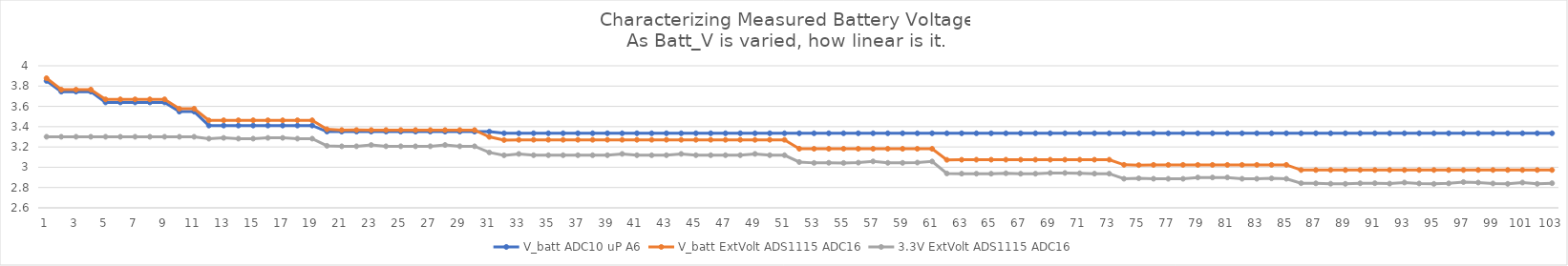
| Category | V_batt ADC10 uP A6 | V_batt ExtVolt ADS1115 ADC16 | 3.3V ExtVolt ADS1115 ADC16 |
|---|---|---|---|
| 0 | 3.851 | 3.878 | 3.3 |
| 1 | 3.745 | 3.765 | 3.3 |
| 2 | 3.745 | 3.765 | 3.3 |
| 3 | 3.745 | 3.766 | 3.3 |
| 4 | 3.639 | 3.669 | 3.3 |
| 5 | 3.639 | 3.669 | 3.3 |
| 6 | 3.639 | 3.669 | 3.3 |
| 7 | 3.639 | 3.669 | 3.3 |
| 8 | 3.639 | 3.67 | 3.3 |
| 9 | 3.548 | 3.577 | 3.3 |
| 10 | 3.548 | 3.577 | 3.3 |
| 11 | 3.411 | 3.462 | 3.281 |
| 12 | 3.411 | 3.463 | 3.29 |
| 13 | 3.411 | 3.463 | 3.282 |
| 14 | 3.411 | 3.463 | 3.282 |
| 15 | 3.411 | 3.463 | 3.29 |
| 16 | 3.411 | 3.462 | 3.29 |
| 17 | 3.411 | 3.463 | 3.282 |
| 18 | 3.411 | 3.463 | 3.282 |
| 19 | 3.351 | 3.374 | 3.211 |
| 20 | 3.351 | 3.367 | 3.206 |
| 21 | 3.351 | 3.367 | 3.207 |
| 22 | 3.351 | 3.366 | 3.219 |
| 23 | 3.351 | 3.367 | 3.207 |
| 24 | 3.351 | 3.366 | 3.207 |
| 25 | 3.351 | 3.367 | 3.206 |
| 26 | 3.351 | 3.366 | 3.207 |
| 27 | 3.351 | 3.366 | 3.219 |
| 28 | 3.351 | 3.367 | 3.207 |
| 29 | 3.351 | 3.367 | 3.207 |
| 30 | 3.351 | 3.3 | 3.146 |
| 31 | 3.335 | 3.268 | 3.118 |
| 32 | 3.335 | 3.27 | 3.132 |
| 33 | 3.335 | 3.27 | 3.119 |
| 34 | 3.335 | 3.27 | 3.119 |
| 35 | 3.335 | 3.27 | 3.119 |
| 36 | 3.335 | 3.27 | 3.119 |
| 37 | 3.335 | 3.27 | 3.119 |
| 38 | 3.335 | 3.27 | 3.119 |
| 39 | 3.335 | 3.27 | 3.132 |
| 40 | 3.335 | 3.27 | 3.119 |
| 41 | 3.335 | 3.27 | 3.119 |
| 42 | 3.335 | 3.27 | 3.119 |
| 43 | 3.335 | 3.27 | 3.132 |
| 44 | 3.335 | 3.27 | 3.119 |
| 45 | 3.335 | 3.27 | 3.119 |
| 46 | 3.335 | 3.27 | 3.119 |
| 47 | 3.335 | 3.27 | 3.119 |
| 48 | 3.335 | 3.27 | 3.132 |
| 49 | 3.335 | 3.27 | 3.119 |
| 50 | 3.335 | 3.27 | 3.119 |
| 51 | 3.335 | 3.183 | 3.052 |
| 52 | 3.335 | 3.182 | 3.043 |
| 53 | 3.335 | 3.182 | 3.044 |
| 54 | 3.335 | 3.182 | 3.042 |
| 55 | 3.335 | 3.182 | 3.045 |
| 56 | 3.335 | 3.182 | 3.058 |
| 57 | 3.335 | 3.182 | 3.044 |
| 58 | 3.335 | 3.182 | 3.044 |
| 59 | 3.335 | 3.182 | 3.046 |
| 60 | 3.335 | 3.182 | 3.057 |
| 61 | 3.335 | 3.073 | 2.938 |
| 62 | 3.335 | 3.074 | 2.937 |
| 63 | 3.335 | 3.074 | 2.936 |
| 64 | 3.335 | 3.074 | 2.936 |
| 65 | 3.335 | 3.074 | 2.941 |
| 66 | 3.335 | 3.074 | 2.936 |
| 67 | 3.335 | 3.074 | 2.936 |
| 68 | 3.335 | 3.074 | 2.944 |
| 69 | 3.335 | 3.074 | 2.944 |
| 70 | 3.335 | 3.074 | 2.941 |
| 71 | 3.335 | 3.074 | 2.937 |
| 72 | 3.335 | 3.074 | 2.936 |
| 73 | 3.335 | 3.024 | 2.887 |
| 74 | 3.335 | 3.021 | 2.891 |
| 75 | 3.335 | 3.023 | 2.887 |
| 76 | 3.335 | 3.024 | 2.886 |
| 77 | 3.335 | 3.024 | 2.886 |
| 78 | 3.335 | 3.023 | 2.899 |
| 79 | 3.335 | 3.023 | 2.899 |
| 80 | 3.335 | 3.023 | 2.899 |
| 81 | 3.335 | 3.024 | 2.886 |
| 82 | 3.335 | 3.024 | 2.886 |
| 83 | 3.335 | 3.024 | 2.89 |
| 84 | 3.335 | 3.024 | 2.886 |
| 85 | 3.335 | 2.972 | 2.843 |
| 86 | 3.335 | 2.972 | 2.842 |
| 87 | 3.335 | 2.973 | 2.838 |
| 88 | 3.335 | 2.972 | 2.837 |
| 89 | 3.335 | 2.973 | 2.842 |
| 90 | 3.335 | 2.972 | 2.843 |
| 91 | 3.335 | 2.973 | 2.839 |
| 92 | 3.335 | 2.972 | 2.85 |
| 93 | 3.335 | 2.973 | 2.84 |
| 94 | 3.335 | 2.973 | 2.836 |
| 95 | 3.335 | 2.972 | 2.841 |
| 96 | 3.335 | 2.972 | 2.854 |
| 97 | 3.335 | 2.973 | 2.849 |
| 98 | 3.335 | 2.973 | 2.84 |
| 99 | 3.335 | 2.973 | 2.836 |
| 100 | 3.335 | 2.972 | 2.85 |
| 101 | 3.335 | 2.972 | 2.836 |
| 102 | 3.335 | 2.972 | 2.843 |